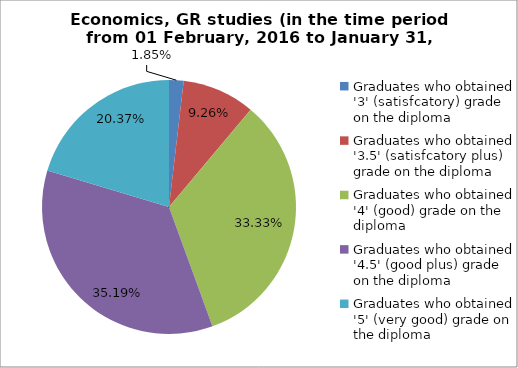
| Category | Series 0 |
|---|---|
| Graduates who obtained '3' (satisfcatory) grade on the diploma  | 1.852 |
| Graduates who obtained '3.5' (satisfcatory plus) grade on the diploma  | 9.259 |
| Graduates who obtained '4' (good) grade on the diploma  | 33.333 |
| Graduates who obtained '4.5' (good plus) grade on the diploma  | 35.185 |
| Graduates who obtained '5' (very good) grade on the diploma  | 20.37 |